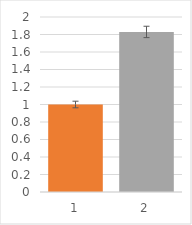
| Category | Series 0 |
|---|---|
| 0 | 1 |
| 1 | 1.829 |